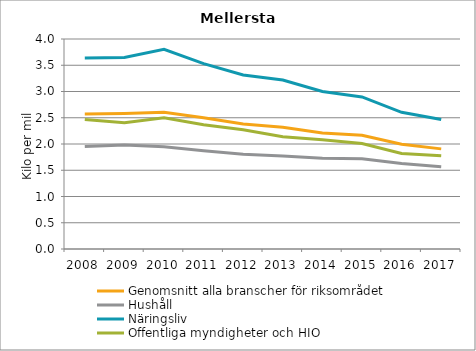
| Category | Genomsnitt alla branscher för riksområdet | Hushåll | Näringsliv | Offentliga myndigheter och HIO |
|---|---|---|---|---|
| 2008 | 2.574 | 1.954 | 3.64 | 2.468 |
| 2009 | 2.581 | 1.979 | 3.649 | 2.404 |
| 2010 | 2.603 | 1.948 | 3.802 | 2.501 |
| 2011 | 2.501 | 1.871 | 3.53 | 2.367 |
| 2012 | 2.382 | 1.803 | 3.315 | 2.273 |
| 2013 | 2.321 | 1.774 | 3.218 | 2.137 |
| 2014 | 2.211 | 1.726 | 3 | 2.081 |
| 2015 | 2.165 | 1.718 | 2.897 | 2.009 |
| 2016 | 1.994 | 1.627 | 2.604 | 1.82 |
| 2017 | 1.907 | 1.568 | 2.466 | 1.775 |